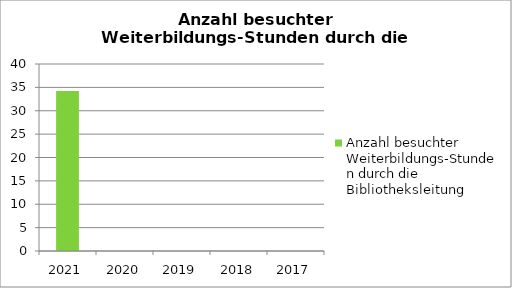
| Category | Anzahl besuchter Weiterbildungs-Stunden durch die Bibliotheksleitung |
|---|---|
| 2021.0 | 34.2 |
| 2020.0 | 0 |
| 2019.0 | 0 |
| 2018.0 | 0 |
| 2017.0 | 0 |